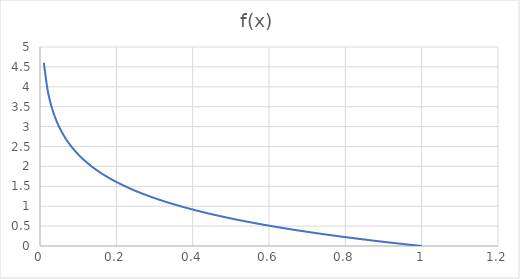
| Category | Series 0 |
|---|---|
| 0.01 | 4.605 |
| 0.02 | 3.912 |
| 0.03 | 3.507 |
| 0.04 | 3.219 |
| 0.05 | 2.996 |
| 0.06 | 2.813 |
| 0.07 | 2.659 |
| 0.08 | 2.526 |
| 0.09 | 2.408 |
| 0.1 | 2.303 |
| 0.11 | 2.207 |
| 0.12 | 2.12 |
| 0.13 | 2.04 |
| 0.14 | 1.966 |
| 0.15 | 1.897 |
| 0.16 | 1.833 |
| 0.17 | 1.772 |
| 0.18 | 1.715 |
| 0.19 | 1.661 |
| 0.2 | 1.609 |
| 0.21 | 1.561 |
| 0.22 | 1.514 |
| 0.23 | 1.47 |
| 0.24 | 1.427 |
| 0.25 | 1.386 |
| 0.26 | 1.347 |
| 0.27 | 1.309 |
| 0.28 | 1.273 |
| 0.29 | 1.238 |
| 0.3 | 1.204 |
| 0.31 | 1.171 |
| 0.32 | 1.139 |
| 0.33 | 1.109 |
| 0.34 | 1.079 |
| 0.35 | 1.05 |
| 0.36 | 1.022 |
| 0.37 | 0.994 |
| 0.38 | 0.968 |
| 0.39 | 0.942 |
| 0.4 | 0.916 |
| 0.41 | 0.892 |
| 0.42 | 0.868 |
| 0.43 | 0.844 |
| 0.44 | 0.821 |
| 0.45 | 0.799 |
| 0.46 | 0.777 |
| 0.47 | 0.755 |
| 0.48 | 0.734 |
| 0.49 | 0.713 |
| 0.5 | 0.693 |
| 0.51 | 0.673 |
| 0.52 | 0.654 |
| 0.53 | 0.635 |
| 0.54 | 0.616 |
| 0.55 | 0.598 |
| 0.56 | 0.58 |
| 0.57 | 0.562 |
| 0.58 | 0.545 |
| 0.59 | 0.528 |
| 0.6 | 0.511 |
| 0.61 | 0.494 |
| 0.62 | 0.478 |
| 0.63 | 0.462 |
| 0.64 | 0.446 |
| 0.65 | 0.431 |
| 0.66 | 0.416 |
| 0.67 | 0.4 |
| 0.68 | 0.386 |
| 0.69 | 0.371 |
| 0.7 | 0.357 |
| 0.71 | 0.342 |
| 0.72 | 0.329 |
| 0.73 | 0.315 |
| 0.74 | 0.301 |
| 0.75 | 0.288 |
| 0.76 | 0.274 |
| 0.77 | 0.261 |
| 0.78 | 0.248 |
| 0.79 | 0.236 |
| 0.8 | 0.223 |
| 0.81 | 0.211 |
| 0.82 | 0.198 |
| 0.83 | 0.186 |
| 0.84 | 0.174 |
| 0.85 | 0.163 |
| 0.86 | 0.151 |
| 0.87 | 0.139 |
| 0.88 | 0.128 |
| 0.89 | 0.117 |
| 0.9 | 0.105 |
| 0.91 | 0.094 |
| 0.92 | 0.083 |
| 0.93 | 0.073 |
| 0.94 | 0.062 |
| 0.95 | 0.051 |
| 0.96 | 0.041 |
| 0.97 | 0.03 |
| 0.98 | 0.02 |
| 0.99 | 0.01 |
| 1.0 | 0 |